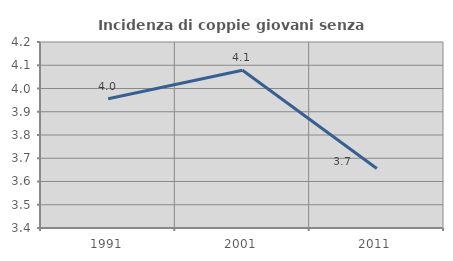
| Category | Incidenza di coppie giovani senza figli |
|---|---|
| 1991.0 | 3.956 |
| 2001.0 | 4.079 |
| 2011.0 | 3.656 |